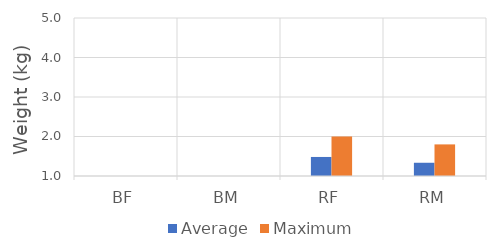
| Category | Average | Maximum |
|---|---|---|
| BF | 0 | 0 |
| BM | 0 | 0 |
| RF | 1.482 | 2 |
| RM | 1.335 | 1.8 |